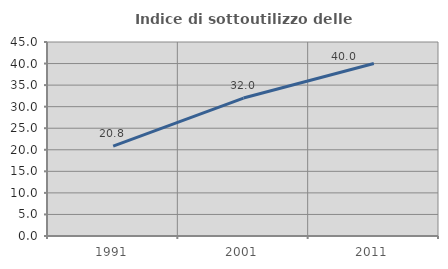
| Category | Indice di sottoutilizzo delle abitazioni  |
|---|---|
| 1991.0 | 20.833 |
| 2001.0 | 32 |
| 2011.0 | 40 |